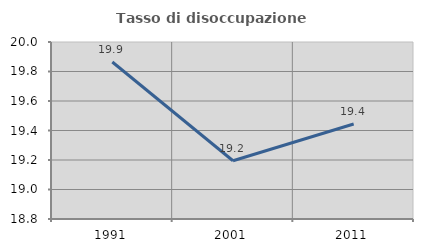
| Category | Tasso di disoccupazione giovanile  |
|---|---|
| 1991.0 | 19.865 |
| 2001.0 | 19.195 |
| 2011.0 | 19.444 |